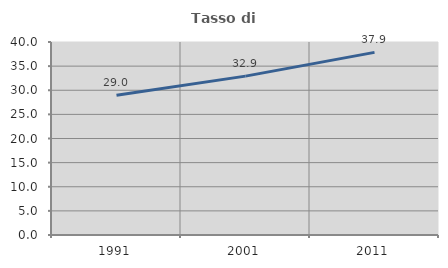
| Category | Tasso di occupazione   |
|---|---|
| 1991.0 | 28.986 |
| 2001.0 | 32.927 |
| 2011.0 | 37.85 |